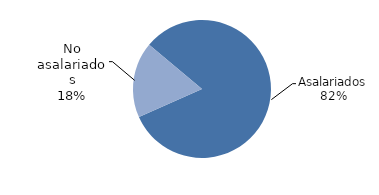
| Category | Formales |
|---|---|
| Asalariados | 2258.803 |
| No asalariados | 487.848 |